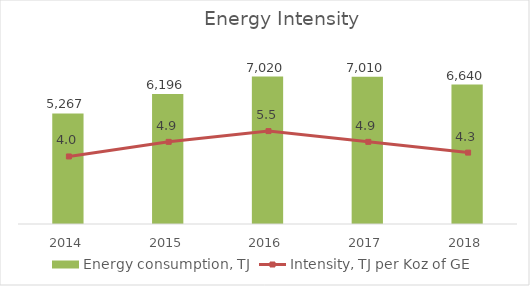
| Category | Energy consumption, TJ |
|---|---|
| 2014.0 | 5267 |
| 2015.0 | 6196 |
| 2016.0 | 7020 |
| 2017.0 | 7010 |
| 2018.0 | 6640 |